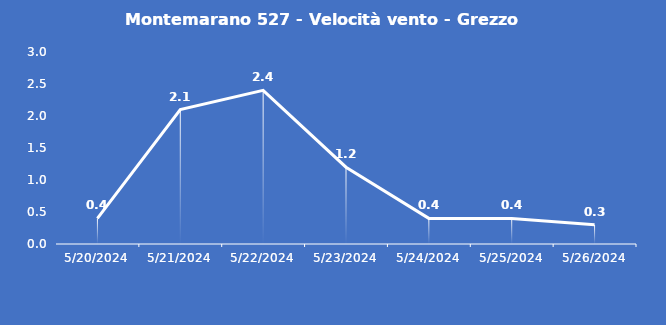
| Category | Montemarano 527 - Velocità vento - Grezzo (m/s) |
|---|---|
| 5/20/24 | 0.4 |
| 5/21/24 | 2.1 |
| 5/22/24 | 2.4 |
| 5/23/24 | 1.2 |
| 5/24/24 | 0.4 |
| 5/25/24 | 0.4 |
| 5/26/24 | 0.3 |